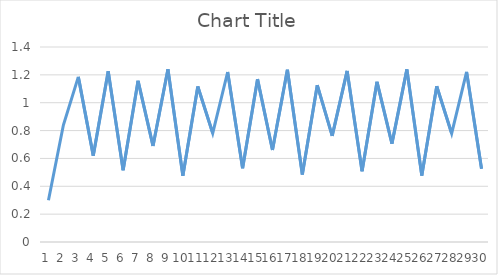
| Category | Series 0 |
|---|---|
| 0 | 0.3 |
| 1 | 0.84 |
| 2 | 1.186 |
| 3 | 0.62 |
| 4 | 1.225 |
| 5 | 0.515 |
| 6 | 1.157 |
| 7 | 0.69 |
| 8 | 1.24 |
| 9 | 0.476 |
| 10 | 1.117 |
| 11 | 0.781 |
| 12 | 1.22 |
| 13 | 0.529 |
| 14 | 1.169 |
| 15 | 0.661 |
| 16 | 1.237 |
| 17 | 0.484 |
| 18 | 1.126 |
| 19 | 0.762 |
| 20 | 1.228 |
| 21 | 0.508 |
| 22 | 1.15 |
| 23 | 0.706 |
| 24 | 1.239 |
| 25 | 0.477 |
| 26 | 1.118 |
| 27 | 0.779 |
| 28 | 1.221 |
| 29 | 0.527 |